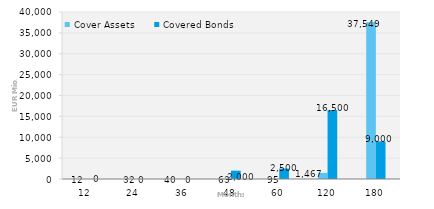
| Category | Cover Assets | Covered Bonds |
|---|---|---|
| 12.0 | 11.882 | 0 |
| 24.0 | 31.848 | 0 |
| 36.0 | 40.092 | 0 |
| 48.0 | 63.061 | 2000 |
| 60.0 | 95.09 | 2500 |
| 120.0 | 1466.929 | 16500 |
| 180.0 | 37548.83 | 9000 |